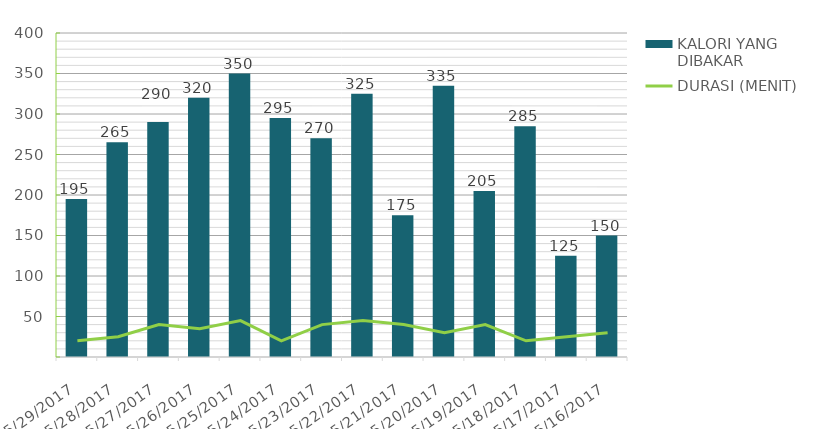
| Category | KALORI YANG DIBAKAR |
|---|---|
| 5/29/17 | 195 |
| 5/28/17 | 265 |
| 5/27/17 | 290 |
| 5/26/17 | 320 |
| 5/25/17 | 350 |
| 5/24/17 | 295 |
| 5/23/17 | 270 |
| 5/22/17 | 325 |
| 5/21/17 | 175 |
| 5/20/17 | 335 |
| 5/19/17 | 205 |
| 5/18/17 | 285 |
| 5/17/17 | 125 |
| 5/16/17 | 150 |